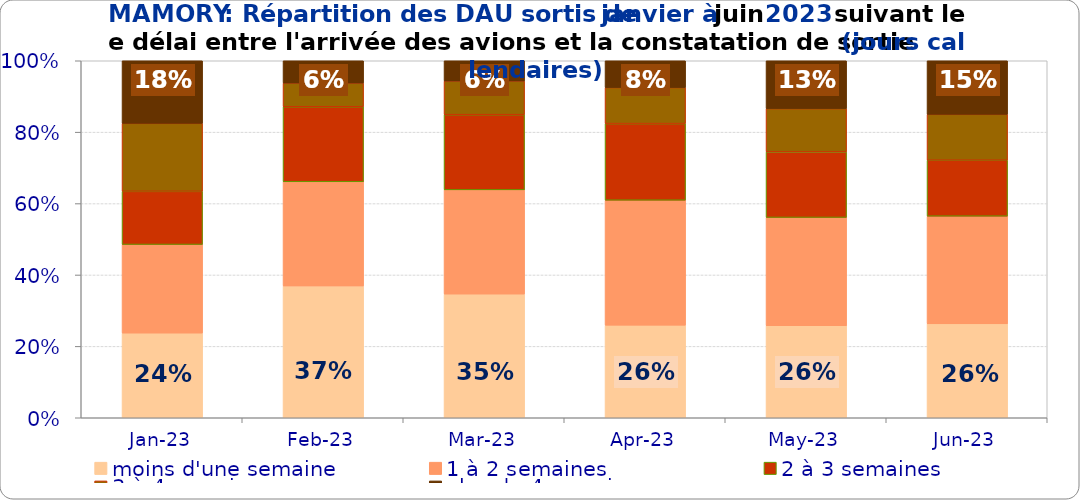
| Category | moins d'une semaine | 1 à 2 semaines | 2 à 3 semaines | 3 à 4 semaines | plus de 4 semaines |
|---|---|---|---|---|---|
| 2023-01-01 | 0.237 | 0.248 | 0.149 | 0.19 | 0.175 |
| 2023-02-01 | 0.369 | 0.292 | 0.21 | 0.066 | 0.062 |
| 2023-03-01 | 0.346 | 0.292 | 0.211 | 0.094 | 0.057 |
| 2023-04-01 | 0.259 | 0.35 | 0.215 | 0.101 | 0.075 |
| 2023-05-01 | 0.258 | 0.303 | 0.184 | 0.121 | 0.134 |
| 2023-06-01 | 0.263 | 0.302 | 0.157 | 0.129 | 0.15 |